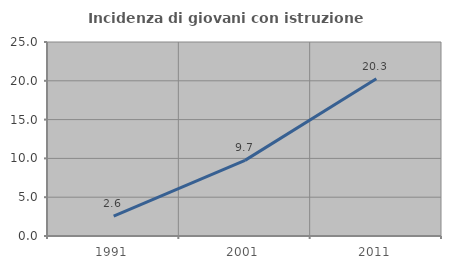
| Category | Incidenza di giovani con istruzione universitaria |
|---|---|
| 1991.0 | 2.553 |
| 2001.0 | 9.747 |
| 2011.0 | 20.27 |